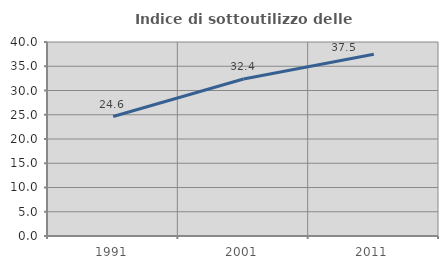
| Category | Indice di sottoutilizzo delle abitazioni  |
|---|---|
| 1991.0 | 24.632 |
| 2001.0 | 32.373 |
| 2011.0 | 37.47 |